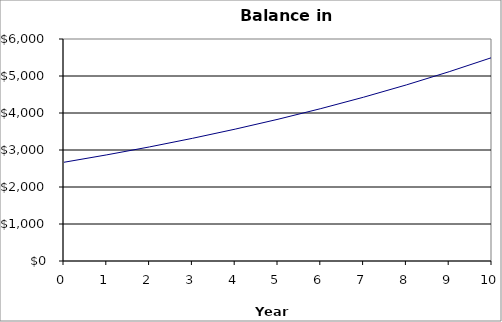
| Category | Series 0 |
|---|---|
| 0.0 | 2668.57 |
| 1.0 | 2868.71 |
| 2.0 | 3083.86 |
| 3.0 | 3315.15 |
| 4.0 | 3563.79 |
| 5.0 | 3831.07 |
| 6.0 | 4118.4 |
| 7.0 | 4427.28 |
| 8.0 | 4759.33 |
| 9.0 | 5116.28 |
| 10.0 | 5500 |